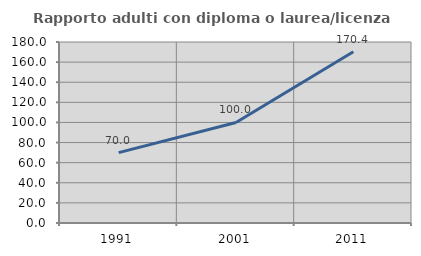
| Category | Rapporto adulti con diploma o laurea/licenza media  |
|---|---|
| 1991.0 | 70 |
| 2001.0 | 100 |
| 2011.0 | 170.391 |